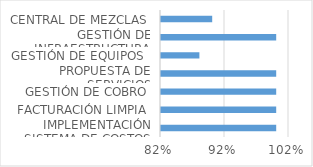
| Category | CUMPLIMIENTO |
|---|---|
| IMPLEMENTACIÓN SISTEMA DE COSTOS | 1 |
| FACTURACIÓN LIMPIA | 1 |
| GESTIÓN DE COBRO | 1 |
| PROPUESTA DE SERVICIOS | 1 |
| GESTIÓN DE EQUIPOS  | 0.88 |
| GESTIÓN DE INFRAESTRUCTURA | 1 |
| CENTRAL DE MEZCLAS | 0.9 |